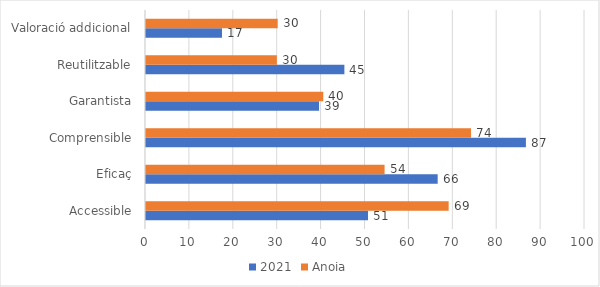
| Category | 2021 | Anoia |
|---|---|---|
| Accessible | 50.577 | 68.942 |
| Eficaç | 66.442 | 54.346 |
| Comprensible | 86.538 | 74.038 |
| Garantista | 39.423 | 40.385 |
| Reutilitzable | 45.192 | 29.808 |
| Valoració addicional | 17.308 | 30 |